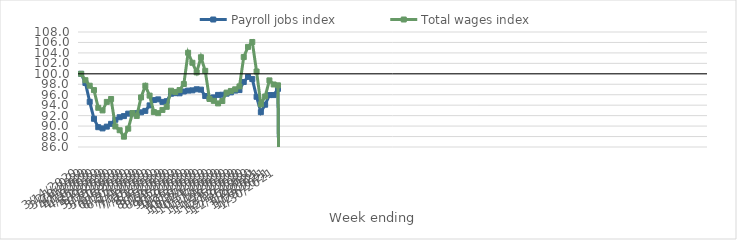
| Category | Payroll jobs index | Total wages index |
|---|---|---|
| 14/03/2020 | 100 | 100 |
| 21/03/2020 | 98.258 | 98.779 |
| 28/03/2020 | 94.644 | 97.724 |
| 04/04/2020 | 91.401 | 96.885 |
| 11/04/2020 | 89.788 | 93.498 |
| 18/04/2020 | 89.56 | 93 |
| 25/04/2020 | 89.897 | 94.625 |
| 02/05/2020 | 90.428 | 95.185 |
| 09/05/2020 | 91.215 | 89.929 |
| 16/05/2020 | 91.693 | 89.208 |
| 23/05/2020 | 91.912 | 87.979 |
| 30/05/2020 | 92.383 | 89.508 |
| 06/06/2020 | 92.422 | 92.486 |
| 13/06/2020 | 92.482 | 91.94 |
| 20/06/2020 | 92.632 | 95.486 |
| 27/06/2020 | 92.91 | 97.712 |
| 04/07/2020 | 93.964 | 95.83 |
| 11/07/2020 | 94.978 | 92.676 |
| 18/07/2020 | 95.113 | 92.472 |
| 25/07/2020 | 94.632 | 93.092 |
| 01/08/2020 | 94.761 | 93.685 |
| 08/08/2020 | 96.186 | 96.77 |
| 15/08/2020 | 96.296 | 96.535 |
| 22/08/2020 | 96.269 | 96.892 |
| 29/08/2020 | 96.615 | 98.046 |
| 05/09/2020 | 96.788 | 104.028 |
| 12/09/2020 | 96.836 | 102.113 |
| 19/09/2020 | 97.045 | 100.271 |
| 26/09/2020 | 96.973 | 103.169 |
| 03/10/2020 | 95.753 | 100.568 |
| 10/10/2020 | 95.38 | 95.187 |
| 17/10/2020 | 95.488 | 94.83 |
| 24/10/2020 | 95.967 | 94.338 |
| 31/10/2020 | 95.994 | 94.799 |
| 07/11/2020 | 96.204 | 96.406 |
| 14/11/2020 | 96.451 | 96.727 |
| 21/11/2020 | 96.788 | 97.033 |
| 28/11/2020 | 96.888 | 97.588 |
| 05/12/2020 | 98.44 | 103.205 |
| 12/12/2020 | 99.409 | 105.154 |
| 19/12/2020 | 98.996 | 106.088 |
| 26/12/2020 | 95.607 | 100.442 |
| 02/01/2021 | 92.665 | 94.158 |
| 09/01/2021 | 94.091 | 95.666 |
| 16/01/2021 | 95.932 | 98.745 |
| 23/01/2021 | 95.932 | 97.962 |
| 30/01/2021 | 97.118 | 97.798 |